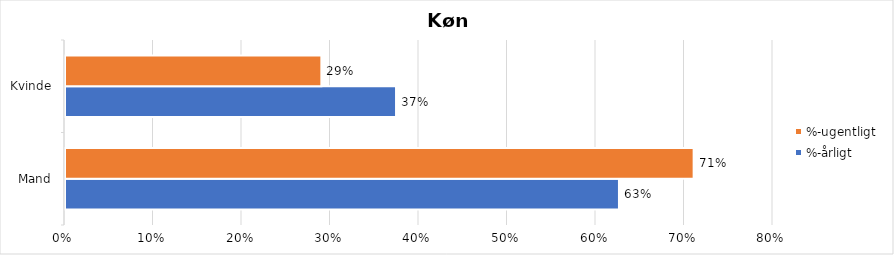
| Category | %-årligt | %-ugentligt |
|---|---|---|
| Mand | 0.626 | 0.71 |
| Kvinde | 0.374 | 0.29 |